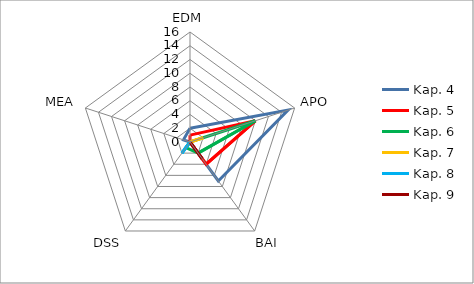
| Category | Kap. 4 | Kap. 5 | Kap. 6 | Kap. 7 | Kap. 8 | Kap. 9 |
|---|---|---|---|---|---|---|
| 0 | 2 | 1 | 0 | 0 | 0 | 0 |
| 1 | 15 | 10 | 10 | 2 | 0 | 0 |
| 2 | 7 | 4 | 2 | 0 | 0 | 3 |
| 3 | 0 | 0 | 1 | 0 | 2 | 0 |
| 4 | 1 | 0 | 0 | 0 | 0 | 0 |